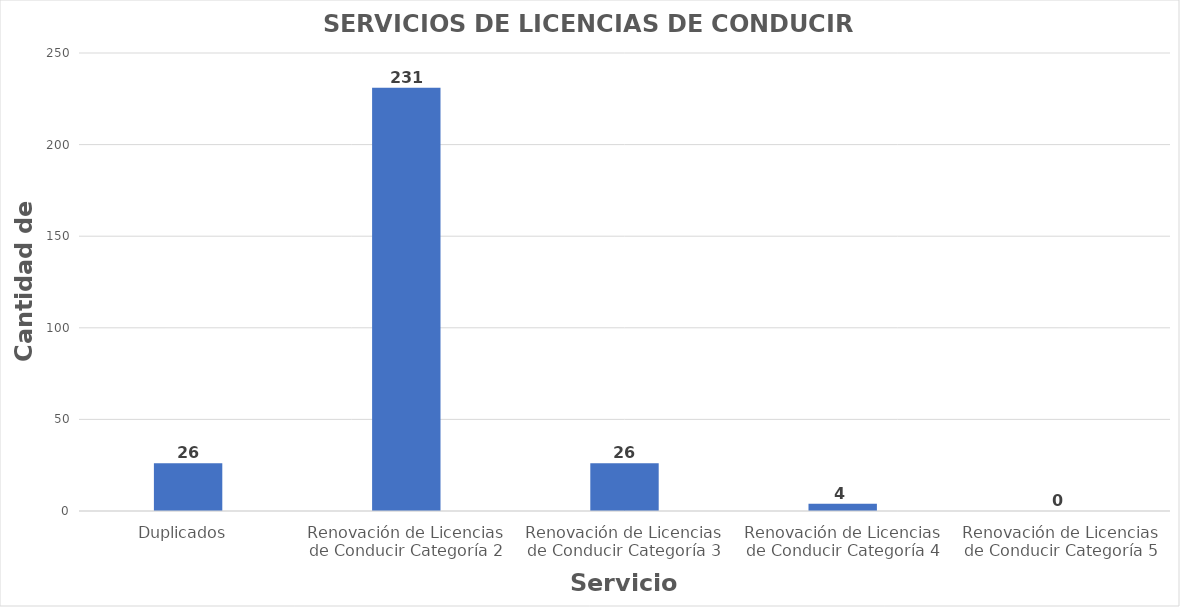
| Category | Series 0 |
|---|---|
| Duplicados  | 26 |
| Renovación de Licencias de Conducir Categoría 2 | 231 |
| Renovación de Licencias de Conducir Categoría 3 | 26 |
| Renovación de Licencias de Conducir Categoría 4 | 4 |
| Renovación de Licencias de Conducir Categoría 5 | 0 |